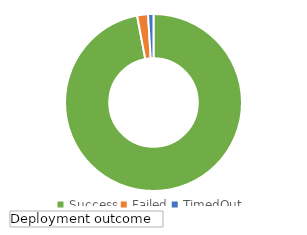
| Category | Total |
|---|---|
| Success | 98 |
| Failed | 2 |
| TimedOut | 1 |